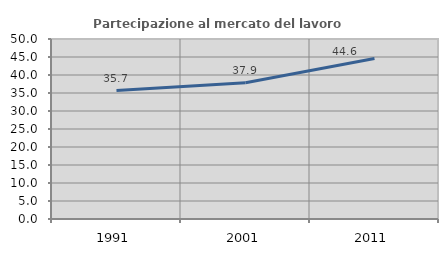
| Category | Partecipazione al mercato del lavoro  femminile |
|---|---|
| 1991.0 | 35.678 |
| 2001.0 | 37.872 |
| 2011.0 | 44.611 |